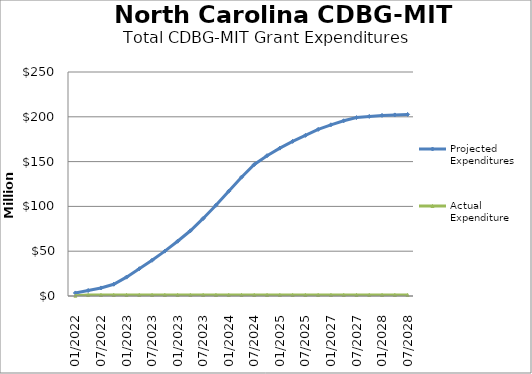
| Category | Projected Expenditures | Actual Expenditure |
|---|---|---|
| 01/2022 | 3400940.542 | 393251.51 |
| 04/2022 | 6156348.257 | 1084981.7 |
| 07/2022 | 8983625.807 | 1134493.33 |
| 10/2022 | 13120903.358 | 1134493.33 |
| 01/2023 | 21040576.974 | 1134493.33 |
| 04/2023 | 30465080.709 | 1134493.33 |
| 07/2023 | 39930436.771 | 1134493.33 |
| 10/2023 | 50069225.98 | 1134493.33 |
| 01/2023 | 61130688.181 | 1134493.33 |
| 04/2023 | 72799792.374 | 1134493.33 |
| 07/2023 | 86547034.099 | 1134493.33 |
| 10/2023 | 101270629.424 | 1134493.33 |
| 01/2024 | 116993248.574 | 1134493.33 |
| 04/2024 | 132621004.612 | 1134493.33 |
| 07/2024 | 146748760.649 | 1134493.33 |
| 10/2024 | 156627619.047 | 1134493.33 |
| 01/2025 | 165023316.109 | 1134493.33 |
| 04/2025 | 172585231.776 | 1134493.33 |
| 07/2025 | 179277691.887 | 1134493.33 |
| 10/2026 | 185970151.999 | 1134493.33 |
| 01/2027 | 191065386.295 | 1134493.33 |
| 04/2027 | 195560621.592 | 1134493.33 |
| 07/2027 | 199160316.666 | 1134493.33 |
| 10/2027 | 200435301.551 | 1134493.33 |
| 01/2028 | 201560286.436 | 1134493.33 |
| 04/2028 | 202115866.092 | 1134493.33 |
| 07/2028 | 202685999.747 | 1134493.33 |